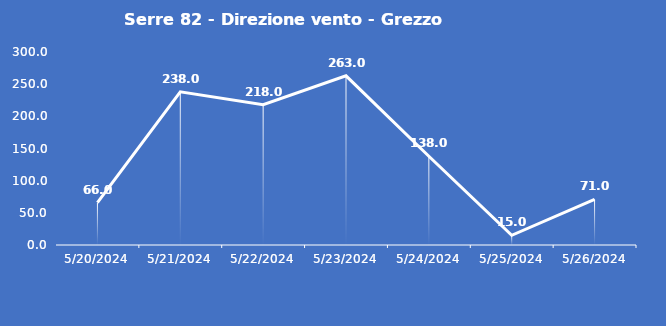
| Category | Serre 82 - Direzione vento - Grezzo (°N) |
|---|---|
| 5/20/24 | 66 |
| 5/21/24 | 238 |
| 5/22/24 | 218 |
| 5/23/24 | 263 |
| 5/24/24 | 138 |
| 5/25/24 | 15 |
| 5/26/24 | 71 |